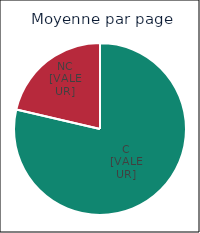
| Category | Series 0 |
|---|---|
| 0 | 0.787 |
| 1 | 0.213 |